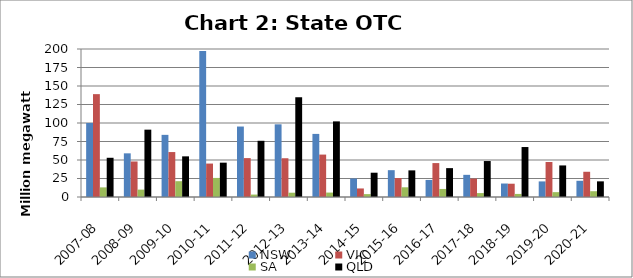
| Category | NSW | VIC | SA | QLD |
|---|---|---|---|---|
| 2007-08 | 100 | 139 | 13 | 53 |
| 2008-09 | 59 | 48 | 10 | 91 |
| 2009-10 | 83.977 | 60.737 | 21.367 | 54.932 |
| 2010-11 | 197.245 | 45.18 | 25.77 | 46.401 |
| 2011-12 | 95.227 | 52.568 | 3.288 | 75.947 |
| 2012-13 | 98.204 | 52.376 | 5.804 | 134.795 |
| 2013-14 | 85.266 | 57.323 | 5.987 | 102.185 |
| 2014-15 | 24.961 | 11.543 | 3.918 | 32.822 |
| 2015-16 | 36.259 | 25.635 | 13.126 | 35.988 |
| 2016-17 | 23.056 | 45.83 | 10.861 | 39.01 |
| 2017-18 | 29.952 | 24.893 | 5.285 | 48.6 |
| 2018-19 | 18.218 | 17.959 | 4.152 | 67.52 |
| 2019-20 | 21.068 | 47.334 | 6.555 | 42.659 |
| 2020-21 | 21.905 | 34.099 | 7.818 | 21.147 |